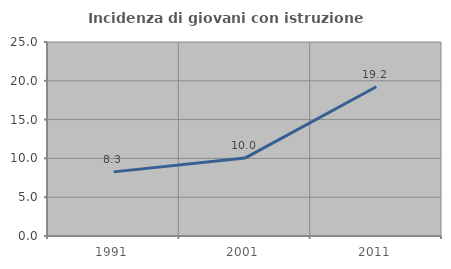
| Category | Incidenza di giovani con istruzione universitaria |
|---|---|
| 1991.0 | 8.264 |
| 2001.0 | 10.044 |
| 2011.0 | 19.231 |